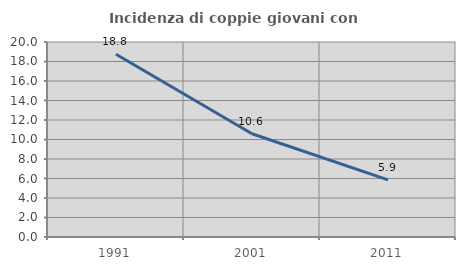
| Category | Incidenza di coppie giovani con figli |
|---|---|
| 1991.0 | 18.75 |
| 2001.0 | 10.588 |
| 2011.0 | 5.865 |